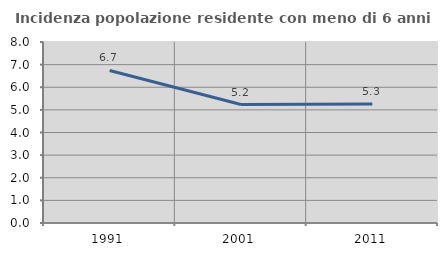
| Category | Incidenza popolazione residente con meno di 6 anni |
|---|---|
| 1991.0 | 6.74 |
| 2001.0 | 5.235 |
| 2011.0 | 5.256 |